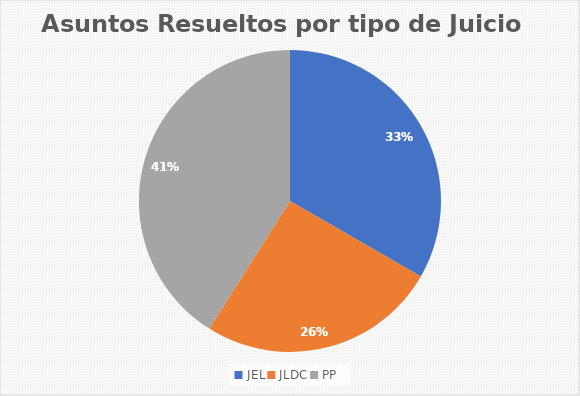
| Category | Rubro Cantidad |
|---|---|
| JEL | 13 |
| JLDC | 10 |
| PP | 16 |